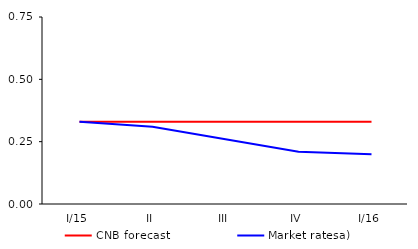
| Category | CNB forecast | Market ratesa) |
|---|---|---|
| I/15 | 0.33 | 0.33 |
| II | 0.33 | 0.31 |
| III | 0.33 | 0.26 |
| IV | 0.33 | 0.21 |
| I/16 | 0.33 | 0.2 |